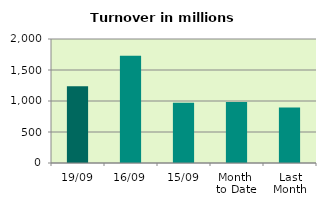
| Category | Series 0 |
|---|---|
| 19/09 | 1237.145 |
| 16/09 | 1731.544 |
| 15/09 | 971.441 |
| Month 
to Date | 983.245 |
| Last
Month | 893.956 |